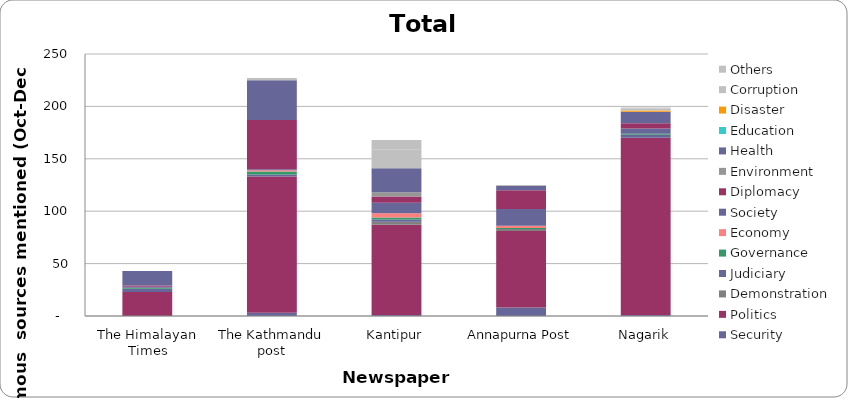
| Category | Security | Politics | Demonstration | Judiciary | Governance | Economy | Society | Diplomacy | Environment | Health | Education | Disaster | Corruption | Others |
|---|---|---|---|---|---|---|---|---|---|---|---|---|---|---|
| The Himalayan Times | 0 | 23 | 0 | 3 | 1 | 0 | 1 | 1 | 0 | 14 | 0 | 0 | 0 | 0 |
| The Kathmandu post | 3 | 130 | 0 | 2 | 3 | 1 | 1 | 47 | 0 | 38 | 0 | 0 | 0 | 2 |
| Kantipur | 1 | 86 | 3 | 2 | 2 | 4 | 10 | 6 | 4 | 23 | 0 | 0 | 18 | 9 |
| Annapurna Post | 8 | 73 | 2 | 0 | 1 | 2 | 16 | 18 | 0 | 4 | 0 | 0 | 0 | 1 |
| Nagarik | 1 | 169 | 0 | 3 | 1 | 0 | 5 | 5 | 0 | 11 | 0 | 1 | 2 | 1 |